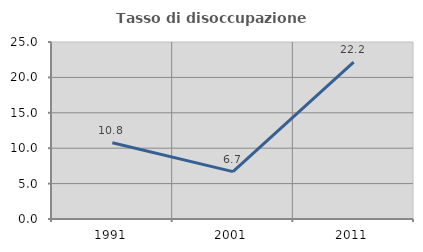
| Category | Tasso di disoccupazione giovanile  |
|---|---|
| 1991.0 | 10.769 |
| 2001.0 | 6.693 |
| 2011.0 | 22.159 |